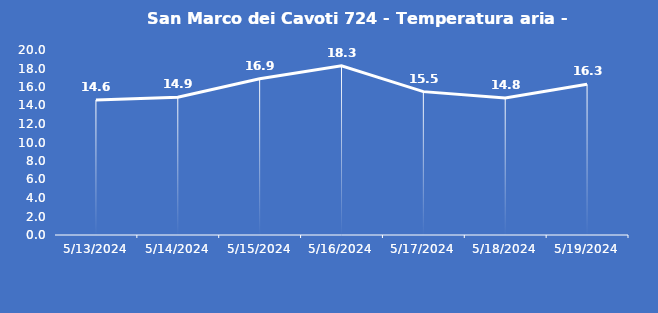
| Category | San Marco dei Cavoti 724 - Temperatura aria - Grezzo (°C) |
|---|---|
| 5/13/24 | 14.6 |
| 5/14/24 | 14.9 |
| 5/15/24 | 16.9 |
| 5/16/24 | 18.3 |
| 5/17/24 | 15.5 |
| 5/18/24 | 14.8 |
| 5/19/24 | 16.3 |